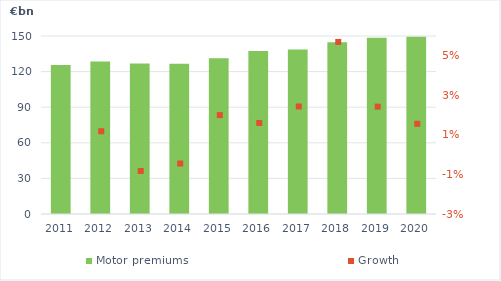
| Category | Motor premiums |
|---|---|
| 2011.0 | 125.56 |
| 2012.0 | 128.604 |
| 2013.0 | 126.737 |
| 2014.0 | 126.599 |
| 2015.0 | 131.3 |
| 2016.0 | 137.4 |
| 2017.0 | 138.635 |
| 2018.0 | 144.687 |
| 2019.0 | 148.536 |
| 2020.0 | 149.392 |